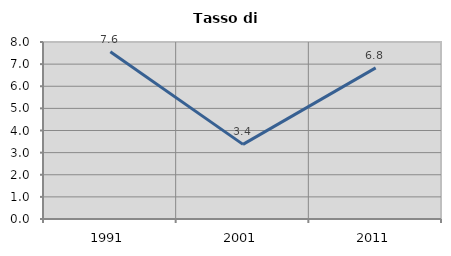
| Category | Tasso di disoccupazione   |
|---|---|
| 1991.0 | 7.559 |
| 2001.0 | 3.373 |
| 2011.0 | 6.829 |